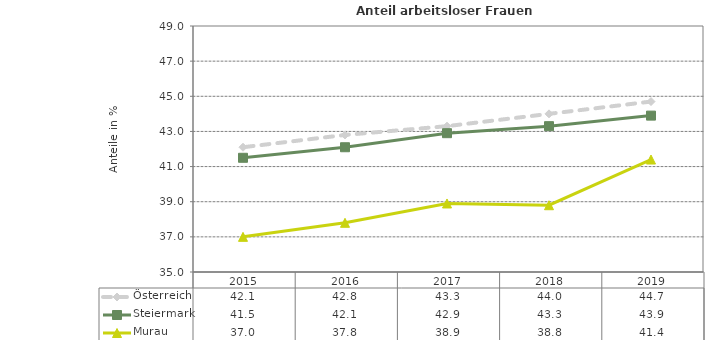
| Category | Österreich | Steiermark | Murau |
|---|---|---|---|
| 2019.0 | 44.7 | 43.9 | 41.4 |
| 2018.0 | 44 | 43.3 | 38.8 |
| 2017.0 | 43.3 | 42.9 | 38.9 |
| 2016.0 | 42.8 | 42.1 | 37.8 |
| 2015.0 | 42.1 | 41.5 | 37 |